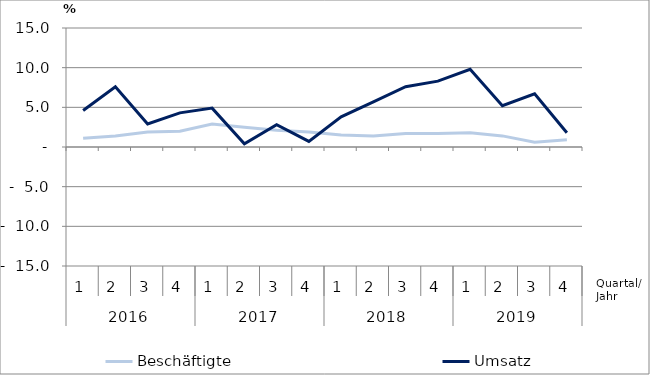
| Category | Beschäftigte | Umsatz |
|---|---|---|
| 0 | 1.1 | 4.6 |
| 1 | 1.4 | 7.6 |
| 2 | 1.9 | 2.9 |
| 3 | 2 | 4.3 |
| 4 | 2.9 | 4.9 |
| 5 | 2.5 | 0.4 |
| 6 | 2.1 | 2.8 |
| 7 | 1.9 | 0.7 |
| 8 | 1.5 | 3.8 |
| 9 | 1.4 | 5.7 |
| 10 | 1.7 | 7.6 |
| 11 | 1.7 | 8.3 |
| 12 | 1.8 | 9.8 |
| 13 | 1.4 | 5.2 |
| 14 | 0.6 | 6.7 |
| 15 | 0.9 | 1.8 |